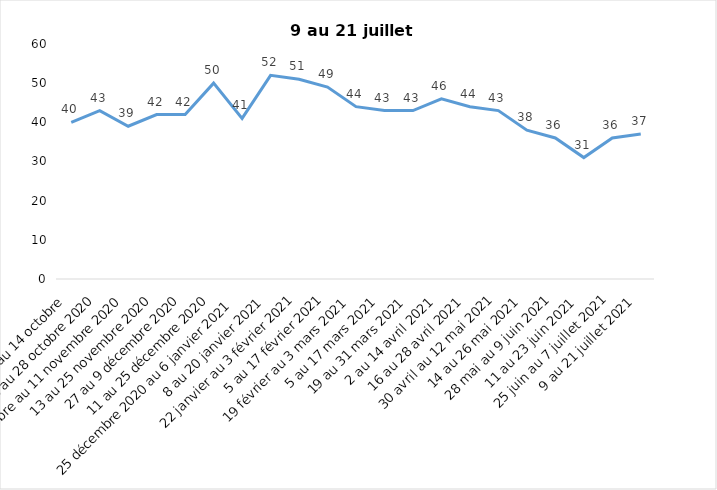
| Category | Toujours aux trois mesures |
|---|---|
| 2 au 14 octobre  | 40 |
| 16 au 28 octobre 2020 | 43 |
| 30 octobre au 11 novembre 2020 | 39 |
| 13 au 25 novembre 2020 | 42 |
| 27 au 9 décembre 2020 | 42 |
| 11 au 25 décembre 2020 | 50 |
| 25 décembre 2020 au 6 janvier 2021 | 41 |
| 8 au 20 janvier 2021 | 52 |
| 22 janvier au 3 février 2021 | 51 |
| 5 au 17 février 2021 | 49 |
| 19 février au 3 mars 2021 | 44 |
| 5 au 17 mars 2021 | 43 |
| 19 au 31 mars 2021 | 43 |
| 2 au 14 avril 2021 | 46 |
| 16 au 28 avril 2021 | 44 |
| 30 avril au 12 mai 2021 | 43 |
| 14 au 26 mai 2021 | 38 |
| 28 mai au 9 juin 2021 | 36 |
| 11 au 23 juin 2021 | 31 |
| 25 juin au 7 juillet 2021 | 36 |
| 9 au 21 juillet 2021 | 37 |